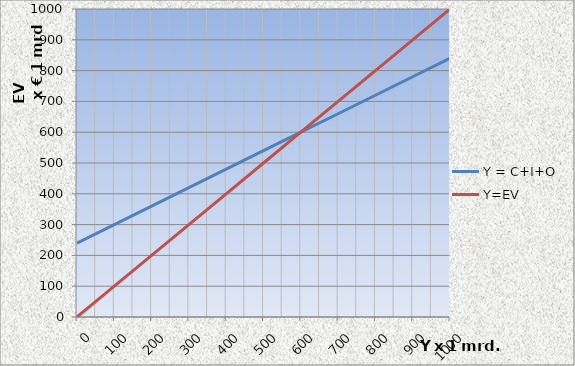
| Category | Y = C+I+O | Y=EV |
|---|---|---|
| 0.0 | 240 | 0 |
| 100.0 | 300 | 100 |
| 200.0 | 360 | 200 |
| 300.0 | 420 | 300 |
| 400.0 | 480 | 400 |
| 500.0 | 540 | 500 |
| 600.0 | 600 | 600 |
| 700.0 | 660 | 700 |
| 800.0 | 720 | 800 |
| 900.0 | 780 | 900 |
| 1000.0 | 840 | 1000 |